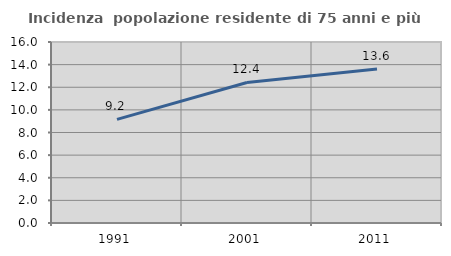
| Category | Incidenza  popolazione residente di 75 anni e più |
|---|---|
| 1991.0 | 9.16 |
| 2001.0 | 12.422 |
| 2011.0 | 13.609 |